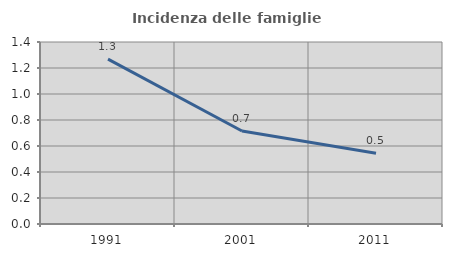
| Category | Incidenza delle famiglie numerose |
|---|---|
| 1991.0 | 1.268 |
| 2001.0 | 0.716 |
| 2011.0 | 0.545 |